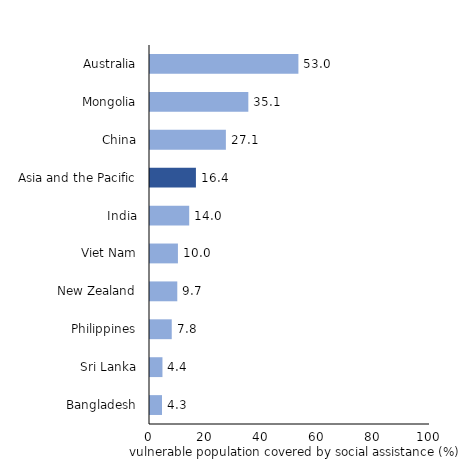
| Category | Vulnerable population covered by SP, % of total vulnerable population |
|---|---|
| Bangladesh | 4.284 |
| Sri Lanka | 4.449 |
| Philippines | 7.765 |
| New Zealand | 9.745 |
| Viet Nam | 9.973 |
| India | 14 |
| Asia and the Pacific | 16.4 |
| China | 27.1 |
| Mongolia | 35.118 |
| Australia | 53 |